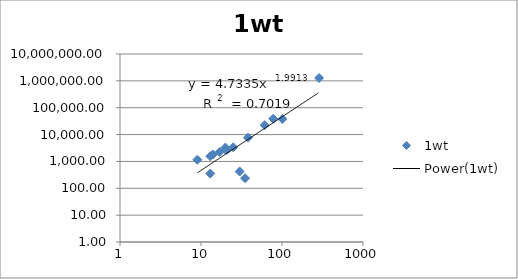
| Category | 1wt |
|---|---|
| 287.0 | 1274482.75 |
| 101.0 | 37980.91 |
| 78.0 | 38882.73 |
| 61.0 | 22403.61 |
| 38.0 | 7679.74 |
| 35.0 | 237.29 |
| 30.0 | 420.92 |
| 25.0 | 3365.72 |
| 21.0 | 2716.16 |
| 20.0 | 3272.03 |
| 20.0 | 2796.18 |
| 17.0 | 2244.17 |
| 14.0 | 1800.63 |
| 13.0 | 352.33 |
| 13.0 | 1562.8 |
| 9.0 | 1151.29 |